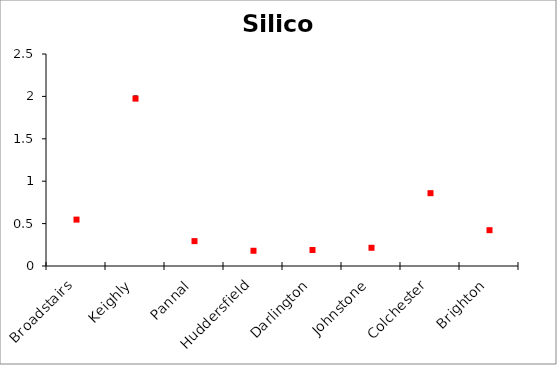
| Category | Silicon | Series 1 | Series 2 |
|---|---|---|---|
| Broadstairs | 0.556 | 0.538 | 0.547 |
| Keighly | 2.008 | 1.954 | 1.974 |
| Pannal | 0.3 | 0.289 | 0.293 |
| Huddersfield | 0.182 | 0.178 | 0.18 |
| Darlington | 0.191 | 0.186 | 0.189 |
| Johnstone | 0.218 | 0.211 | 0.215 |
| Colchester | 0.867 | 0.849 | 0.859 |
| Brighton | 0.429 | 0.417 | 0.422 |